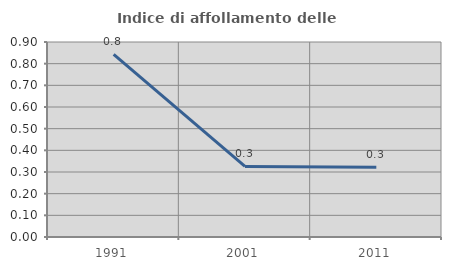
| Category | Indice di affollamento delle abitazioni  |
|---|---|
| 1991.0 | 0.843 |
| 2001.0 | 0.326 |
| 2011.0 | 0.322 |